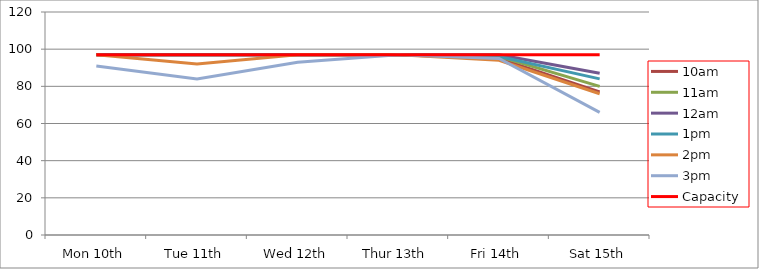
| Category | 9am | 10am | 11am | 12am | 1pm | 2pm | 3pm | 4pm | 5pm | Capacity |
|---|---|---|---|---|---|---|---|---|---|---|
| Mon 10th |  | 97 | 97 | 97 | 97 | 97 | 91 |  |  | 97 |
| Tue 11th |  | 97 | 97 | 97 | 97 | 92 | 84 |  |  | 97 |
| Wed 12th |  | 97 | 97 | 97 | 97 | 97 | 93 |  |  | 97 |
| Thur 13th |  | 97 | 97 | 97 | 97 | 97 | 97 |  |  | 97 |
| Fri 14th |  | 95 | 96 | 97 | 96 | 94 | 95 |  |  | 97 |
| Sat 15th |  | 77 | 80 | 87 | 84 | 76 | 66 |  |  | 97 |